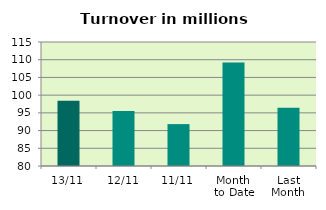
| Category | Series 0 |
|---|---|
| 13/11 | 98.407 |
| 12/11 | 95.544 |
| 11/11 | 91.828 |
| Month 
to Date | 109.248 |
| Last
Month | 96.433 |